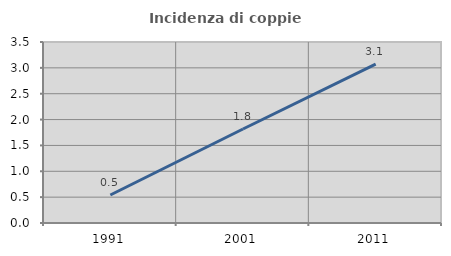
| Category | Incidenza di coppie miste |
|---|---|
| 1991.0 | 0.542 |
| 2001.0 | 1.818 |
| 2011.0 | 3.073 |